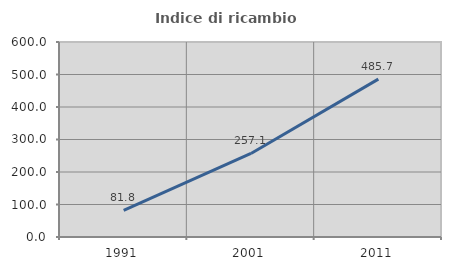
| Category | Indice di ricambio occupazionale  |
|---|---|
| 1991.0 | 81.818 |
| 2001.0 | 257.143 |
| 2011.0 | 485.714 |